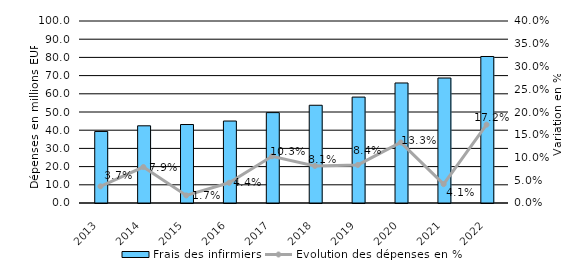
| Category | Frais des infirmiers |
|---|---|
| 2013.0 | 39.309 |
| 2014.0 | 42.415 |
| 2015.0 | 43.121 |
| 2016.0 | 45.038 |
| 2017.0 | 49.663 |
| 2018.0 | 53.707 |
| 2019.0 | 58.198 |
| 2020.0 | 65.944 |
| 2021.0 | 68.675 |
| 2022.0 | 80.5 |